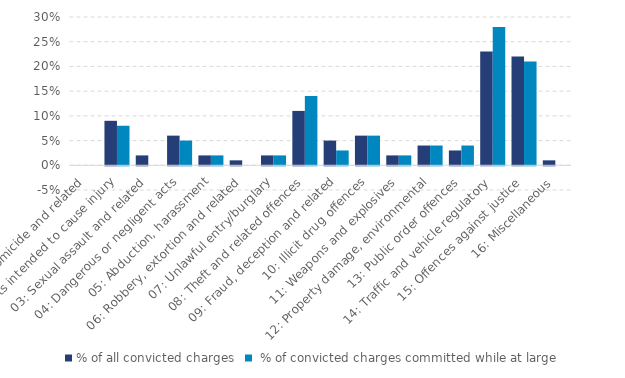
| Category | % of all convicted charges |  % of convicted charges committed while at large |
|---|---|---|
| 01: Homicide and related | 0 | 0 |
| 02: Acts intended to cause injury | 0.09 | 0.08 |
| 03: Sexual assault and related | 0.02 | 0 |
| 04: Dangerous or negligent acts | 0.06 | 0.05 |
| 05: Abduction, harassment | 0.02 | 0.02 |
| 06: Robbery, extortion and related | 0.01 | 0 |
| 07: Unlawful entry/burglary | 0.02 | 0.02 |
| 08: Theft and related offences | 0.11 | 0.14 |
| 09: Fraud, deception and related | 0.05 | 0.03 |
| 10: Illicit drug offences | 0.06 | 0.06 |
| 11: Weapons and explosives | 0.02 | 0.02 |
| 12: Property damage, environmental | 0.04 | 0.04 |
| 13: Public order offences | 0.03 | 0.04 |
| 14: Traffic and vehicle regulatory | 0.23 | 0.28 |
| 15: Offences against justice | 0.22 | 0.21 |
| 16: Miscellaneous | 0.01 | 0 |